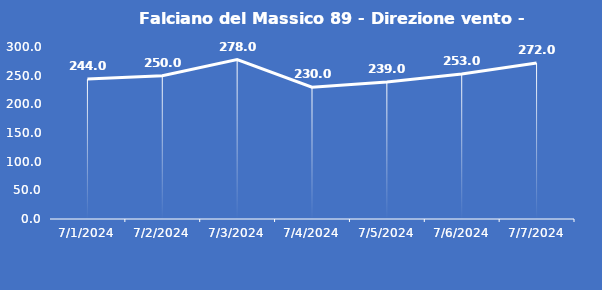
| Category | Falciano del Massico 89 - Direzione vento - Grezzo (°N) |
|---|---|
| 7/1/24 | 244 |
| 7/2/24 | 250 |
| 7/3/24 | 278 |
| 7/4/24 | 230 |
| 7/5/24 | 239 |
| 7/6/24 | 253 |
| 7/7/24 | 272 |